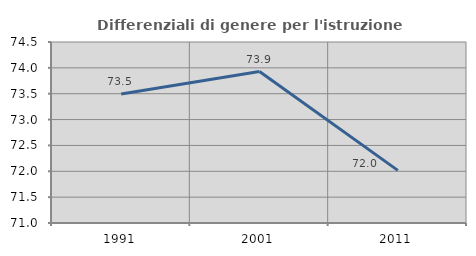
| Category | Differenziali di genere per l'istruzione superiore |
|---|---|
| 1991.0 | 73.493 |
| 2001.0 | 73.928 |
| 2011.0 | 72.017 |